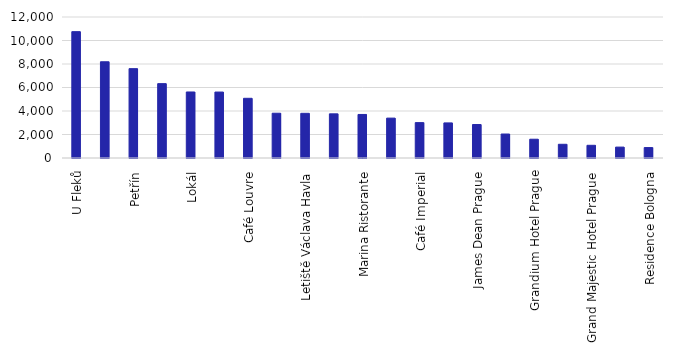
| Category | Počet Google recenzí |
|---|---|
| U Fleků | 10753 |
|  | 8189 |
| Petřín | 7604 |
| Hard Rock Cafe | 6328 |
| Lokál | 5619 |
| Státní hrad a zámek Český Krumlov  | 5613 |
| Café Louvre | 5080 |
| Kozlovna Apropos | 3811 |
| Letiště Václava Havla | 3802 |
| Havelská Koruna | 3759 |
| Marina Ristorante | 3705 |
| Karlštejn | 3394 |
| Café Imperial | 3011 |
| Restaurace U Vejvodů | 2986 |
| James Dean Prague | 2849 |
| Katedrála sv. Barbory | 2040 |
| Grandium Hotel Prague | 1598 |
| ibis Praha Old Town | 1167 |
| Grand Majestic Hotel Prague | 1080 |
| Majestic Plaza Hotel Prague | 928 |
| Residence Bologna | 887 |